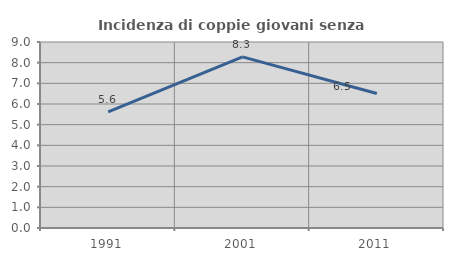
| Category | Incidenza di coppie giovani senza figli |
|---|---|
| 1991.0 | 5.624 |
| 2001.0 | 8.28 |
| 2011.0 | 6.507 |